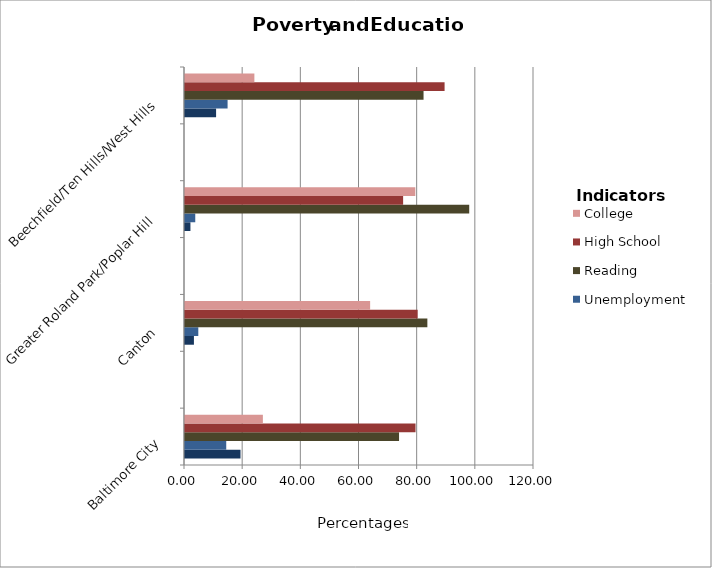
| Category | Poverty | Unemployment | Reading | High School | College |
|---|---|---|---|---|---|
| Baltimore City | 19.083 | 14.178 | 73.6 | 79.261 | 26.777 |
|  | 0 | 0 | 0 | 0 | 0 |
| Canton | 3.068 | 4.574 | 83.333 | 80 | 63.657 |
|  | 0 | 0 | 0 | 0 | 0 |
| Greater Roland Park/Poplar Hill | 1.867 | 3.53 | 97.727 | 75 | 79.186 |
|  | 0 | 0 | 0 | 0 | 0 |
| Beechfield/Ten Hills/West Hills | 10.69 | 14.643 | 82.022 | 89.256 | 23.855 |